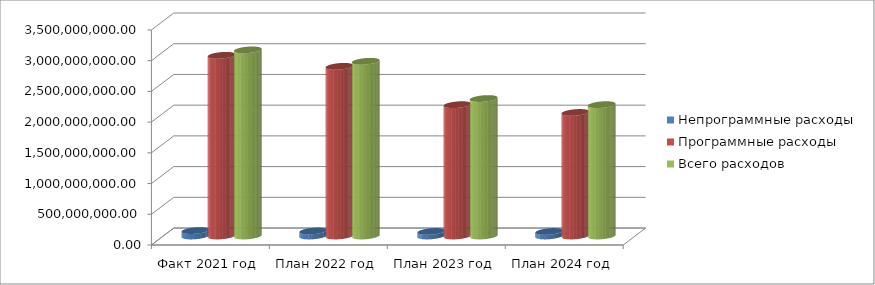
| Category | Непрограммные расходы | Программные расходы | Всего расходов |
|---|---|---|---|
| Факт 2021 год | 88271042.59 | 2940800625.65 | 3029071668.24 |
| План 2022 год | 82081710 | 2761514352.52 | 2843596062.52 |
| План 2023 год | 73921210 | 2137586850 | 2237508060 |
| План 2024 год | 73454610 | 2010778140 | 2137832750 |